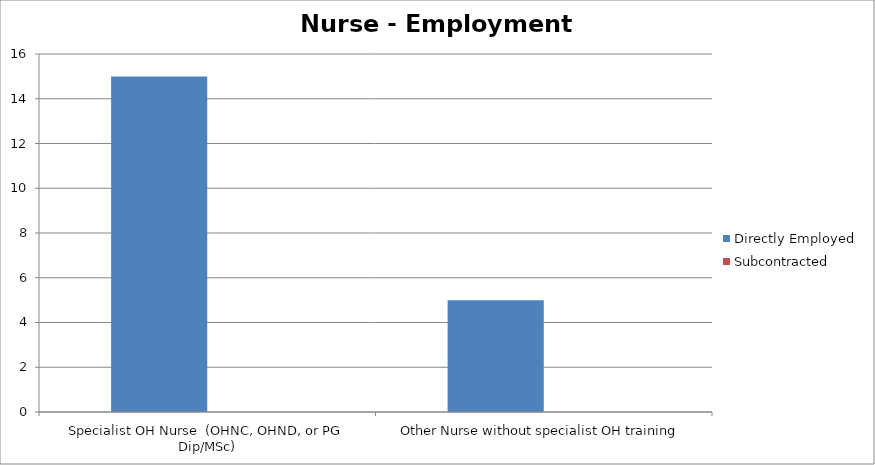
| Category | Directly Employed | Subcontracted |
|---|---|---|
| Specialist OH Nurse  (OHNC, OHND, or PG Dip/MSc) | 15 | 0 |
| Other Nurse without specialist OH training | 5 | 0 |